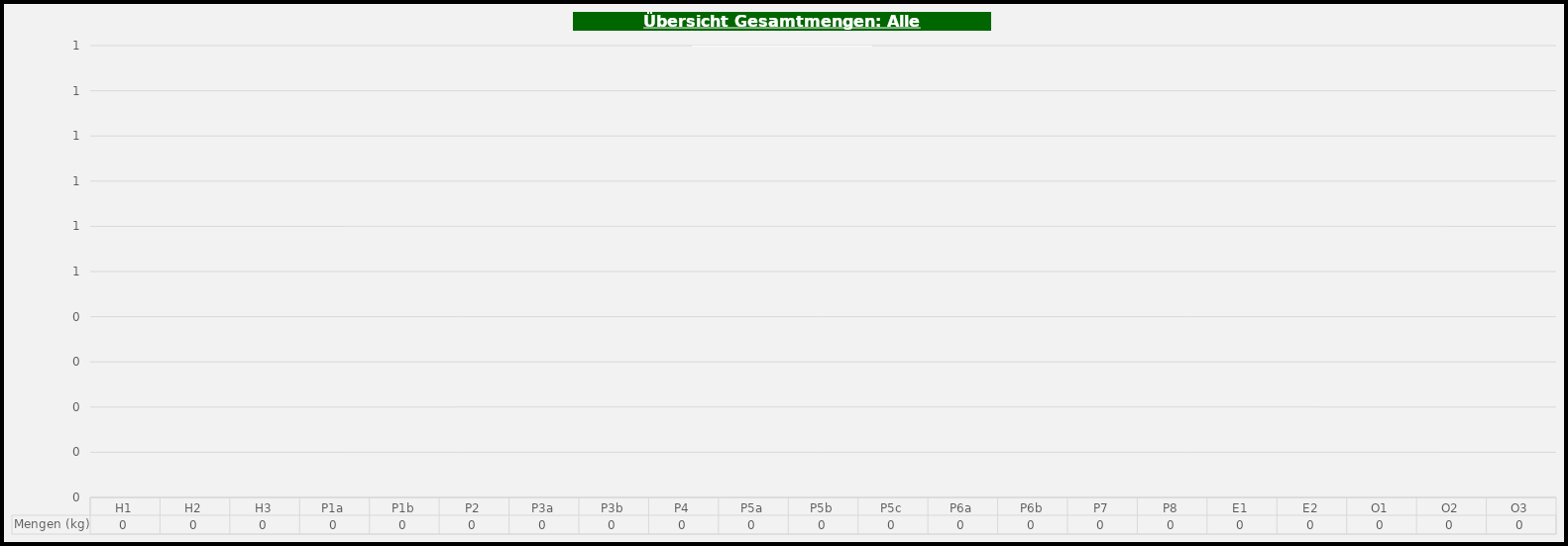
| Category | Mengen (kg) |
|---|---|
| H1 | 0 |
| H2 | 0 |
| H3 | 0 |
| P1a | 0 |
| P1b | 0 |
| P2 | 0 |
| P3a | 0 |
| P3b | 0 |
| P4 | 0 |
| P5a | 0 |
| P5b | 0 |
| P5c | 0 |
| P6a | 0 |
| P6b | 0 |
| P7 | 0 |
| P8 | 0 |
| E1 | 0 |
| E2 | 0 |
| O1 | 0 |
| O2 | 0 |
| O3 | 0 |